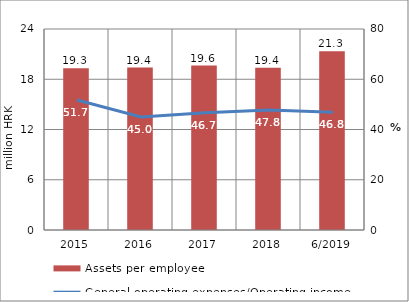
| Category | Assets per employee |
|---|---|
| 2015 | 19.32 |
| 2016 | 19.391 |
| 2017 | 19.639 |
| 2018 | 19.378 |
| 6/2019 | 21.339 |